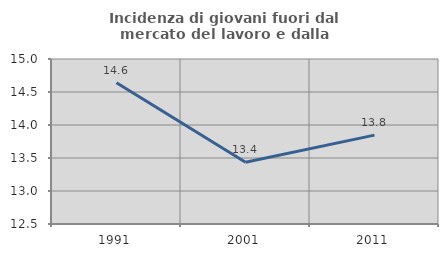
| Category | Incidenza di giovani fuori dal mercato del lavoro e dalla formazione  |
|---|---|
| 1991.0 | 14.64 |
| 2001.0 | 13.437 |
| 2011.0 | 13.846 |